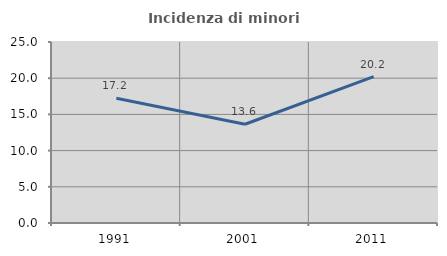
| Category | Incidenza di minori stranieri |
|---|---|
| 1991.0 | 17.241 |
| 2001.0 | 13.636 |
| 2011.0 | 20.228 |